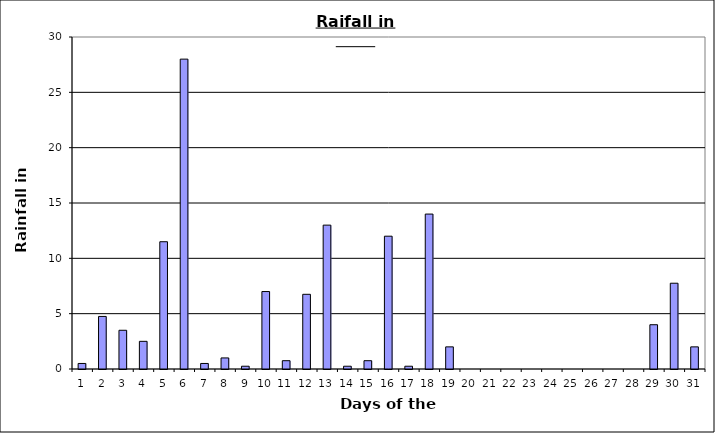
| Category | Series 0 |
|---|---|
| 0 | 0.5 |
| 1 | 4.75 |
| 2 | 3.5 |
| 3 | 2.5 |
| 4 | 11.5 |
| 5 | 28 |
| 6 | 0.5 |
| 7 | 1 |
| 8 | 0.25 |
| 9 | 7 |
| 10 | 0.75 |
| 11 | 6.75 |
| 12 | 13 |
| 13 | 0.25 |
| 14 | 0.75 |
| 15 | 12 |
| 16 | 0.25 |
| 17 | 14 |
| 18 | 2 |
| 19 | 0 |
| 20 | 0 |
| 21 | 0 |
| 22 | 0 |
| 23 | 0 |
| 24 | 0 |
| 25 | 0 |
| 26 | 0 |
| 27 | 0 |
| 28 | 4 |
| 29 | 7.75 |
| 30 | 2 |